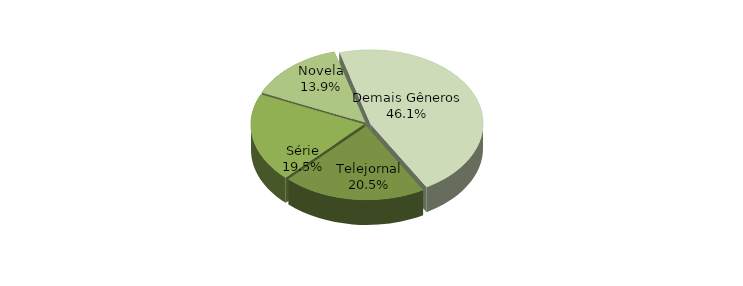
| Category | Series 0 |
|---|---|
| Telejornal | 0.205 |
| Série | 0.195 |
| Novela | 0.139 |
| Demais Gêneros | 0.461 |